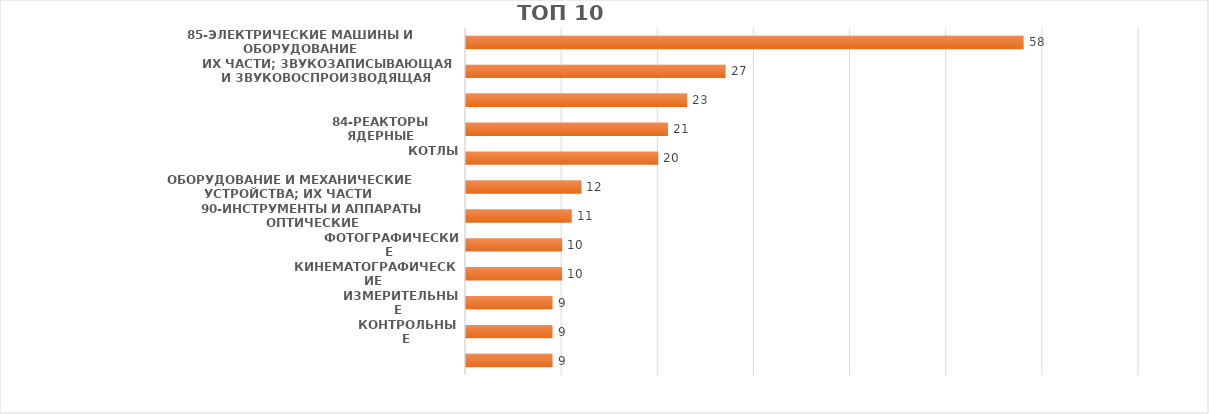
| Category | Итог |
|---|---|
| 85-ЭЛЕКТРИЧЕСКИЕ МАШИНЫ И ОБОРУДОВАНИЕ, ИХ ЧАСТИ; ЗВУКОЗАПИСЫВАЮЩАЯ И ЗВУКОВОСПРОИЗВОДЯЩАЯ АППАРАТУРА, | 58 |
| 84-РЕАКТОРЫ ЯДЕРНЫЕ, КОТЛЫ, ОБОРУДОВАНИЕ И МЕХАНИЧЕСКИЕ УСТРОЙСТВА; ИХ ЧАСТИ | 27 |
| 90-ИНСТРУМЕНТЫ И АППАРАТЫ ОПТИЧЕСКИЕ, ФОТОГРАФИЧЕСКИЕ, КИНЕМАТОГРАФИЧЕСКИЕ, ИЗМЕРИТЕЛЬНЫЕ, КОНТРОЛЬНЫЕ, | 23 |
| 39-ПЛАСТМАССЫ И ИЗДЕЛИЯ ИЗ НИХ | 21 |
| 94-МЕБЕЛЬ; ПОСТЕЛЬНЫЕ ПРИНАДЛЕЖНОСТИ, МАТРАЦЫ, ОСНОВЫ МАТРАЦНЫЕ, ДИВАННЫЕ ПОДУШКИ И АНАЛОГИЧНЫЕ НАБИВНЫ | 20 |
| 40-КАУЧУК, РЕЗИНА И ИЗДЕЛИЯ ИЗ НИХ | 12 |
| 76-АЛЮМИНИЙ И ИЗДЕЛИЯ ИЗ НЕГО | 11 |
| 73-ИЗДЕЛИЯ ИЗ ЧЕРНЫХ МЕТАЛЛОВ | 10 |
| 87-СРЕДСТВА НАЗЕМНОГО ТРАНСПОРТА, КРОМЕ ЖЕЛЕЗНОДОРОЖНОГО ИЛИ ТРАМВАЙНОГО ПОДВИЖНОГО СОСТАВА, И ИХ ЧАСТИ | 10 |
| 70-СТЕКЛО И ИЗДЕЛИЯ ИЗ НЕГО | 9 |
| 74-МЕДЬ И ИЗДЕЛИЯ ИЗ НЕЕ | 9 |
| 82-ИНСТРУМЕНТЫ, ПРИСПОСОБЛЕНИЯ, НОЖЕВЫЕ ИЗДЕЛИЯ, ЛОЖКИ И ВИЛКИ ИЗ НЕДРАГОЦЕННЫХ МЕТАЛЛОВ; ИХ ЧАСТИ ИЗ Н | 9 |